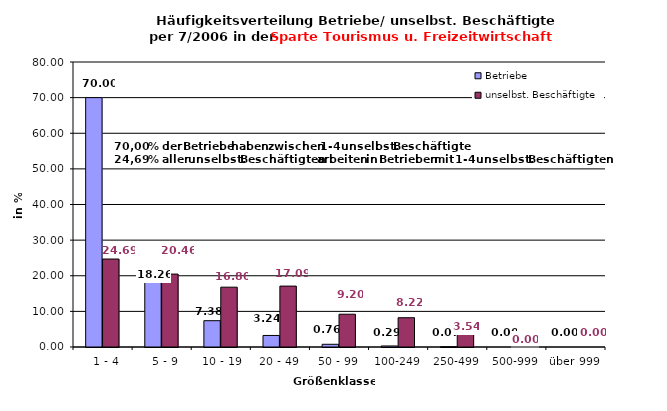
| Category | Betriebe | unselbst. Beschäftigte |
|---|---|---|
|   1 - 4 | 70.002 | 24.694 |
|   5 - 9 | 18.256 | 20.464 |
|  10 - 19 | 7.382 | 16.796 |
| 20 - 49 | 3.239 | 17.093 |
| 50 - 99 | 0.76 | 9.198 |
| 100-249 | 0.289 | 8.219 |
| 250-499 | 0.072 | 3.536 |
| 500-999 | 0 | 0 |
| über 999 | 0 | 0 |